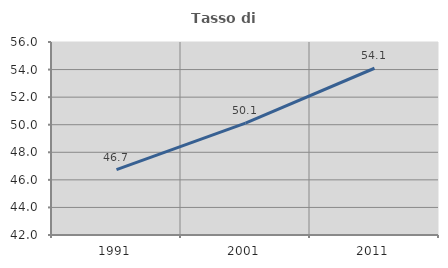
| Category | Tasso di occupazione   |
|---|---|
| 1991.0 | 46.743 |
| 2001.0 | 50.113 |
| 2011.0 | 54.096 |